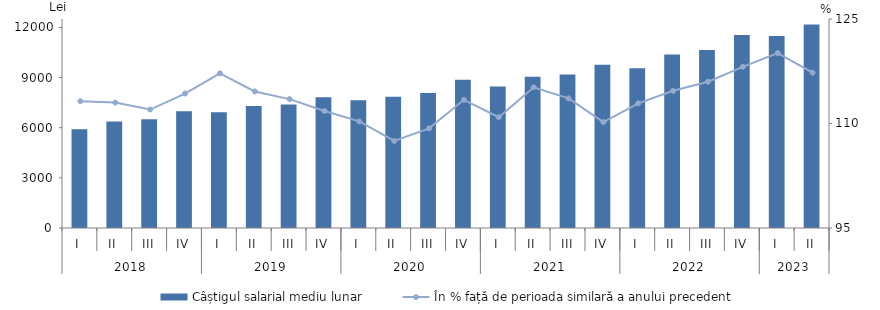
| Category | Câștigul salarial mediu lunar |
|---|---|
| 0 | 5906.5 |
| 1 | 6369.8 |
| 2 | 6507.3 |
| 3 | 6987.5 |
| 4 | 6923 |
| 5 | 7302.6 |
| 6 | 7385 |
| 7 | 7813.1 |
| 8 | 7633.9 |
| 9 | 7849 |
| 10 | 8074.3 |
| 11 | 8859.9 |
| 12 | 8468.6 |
| 13 | 9044.5 |
| 14 | 9175.7 |
| 15 | 9767.6 |
| 16 | 9560.8 |
| 17 | 10376.2 |
| 18 | 10648.1 |
| 19 | 11539.1 |
| 20 | 11486.2 |
| 21 | 12175.9 |